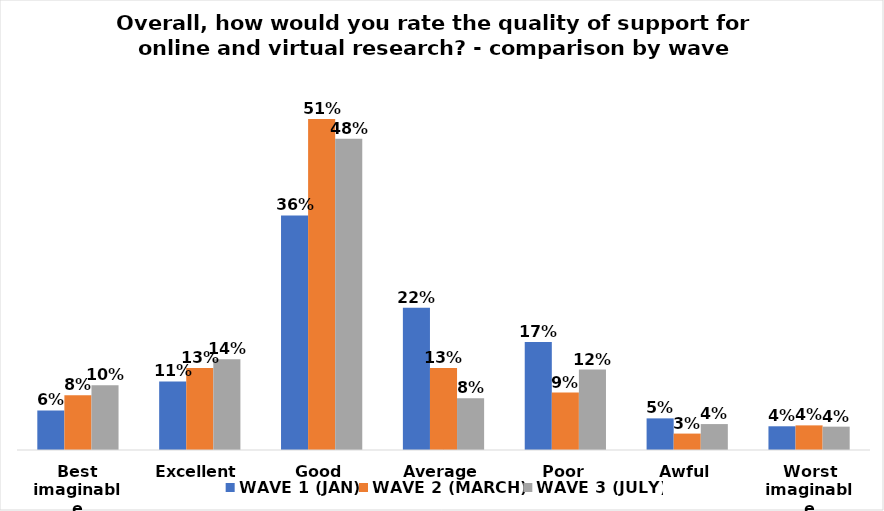
| Category | WAVE 1 (JAN) | WAVE 2 (MARCH) | WAVE 3 (JULY) |
|---|---|---|---|
| Best imaginable | 0.061 | 0.084 | 0.1 |
| Excellent | 0.106 | 0.127 | 0.14 |
| Good | 0.362 | 0.511 | 0.48 |
| Average | 0.22 | 0.127 | 0.08 |
| Poor | 0.167 | 0.089 | 0.124 |
| Awful | 0.049 | 0.025 | 0.04 |
| Worst imaginable | 0.037 | 0.038 | 0.036 |